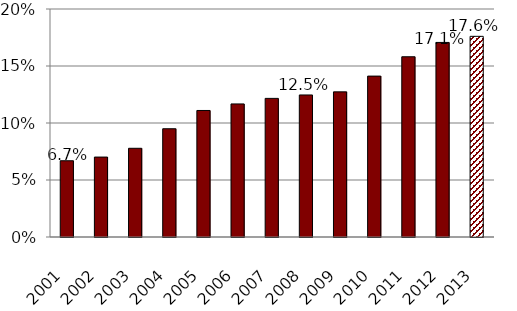
| Category | ARC/Payroll |
|---|---|
| 2001.0 | 0.067 |
| 2002.0 | 0.07 |
| 2003.0 | 0.078 |
| 2004.0 | 0.095 |
| 2005.0 | 0.111 |
| 2006.0 | 0.117 |
| 2007.0 | 0.122 |
| 2008.0 | 0.125 |
| 2009.0 | 0.127 |
| 2010.0 | 0.141 |
| 2011.0 | 0.158 |
| 2012.0 | 0.171 |
| 2013.0 | 0.176 |